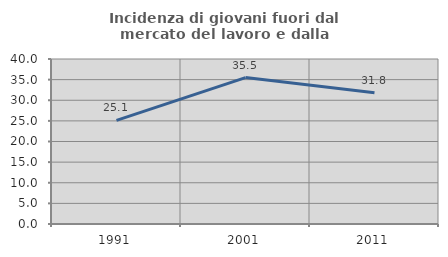
| Category | Incidenza di giovani fuori dal mercato del lavoro e dalla formazione  |
|---|---|
| 1991.0 | 25.112 |
| 2001.0 | 35.501 |
| 2011.0 | 31.828 |